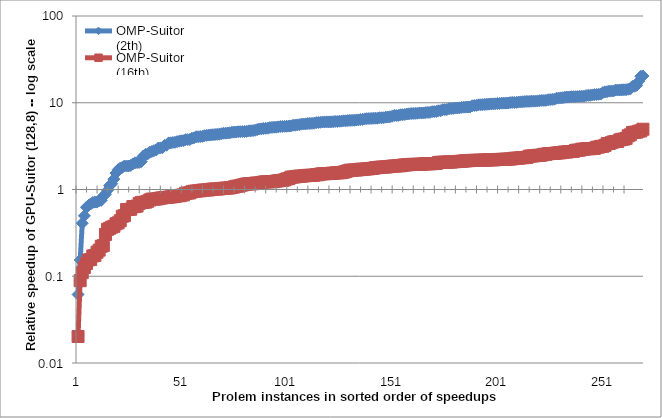
| Category | OMP-Suitor(2th) | OMP-Suitor(16th) |
|---|---|---|
| 0 | 0.062 | 0.02 |
| 1 | 0.154 | 0.089 |
| 2 | 0.409 | 0.11 |
| 3 | 0.497 | 0.126 |
| 4 | 0.624 | 0.14 |
| 5 | 0.655 | 0.154 |
| 6 | 0.682 | 0.156 |
| 7 | 0.709 | 0.171 |
| 8 | 0.716 | 0.174 |
| 9 | 0.716 | 0.189 |
| 10 | 0.741 | 0.2 |
| 11 | 0.749 | 0.221 |
| 12 | 0.843 | 0.226 |
| 13 | 0.881 | 0.303 |
| 14 | 0.981 | 0.347 |
| 15 | 1.11 | 0.357 |
| 16 | 1.167 | 0.368 |
| 17 | 1.315 | 0.376 |
| 18 | 1.548 | 0.402 |
| 19 | 1.692 | 0.413 |
| 20 | 1.763 | 0.436 |
| 21 | 1.798 | 0.492 |
| 22 | 1.865 | 0.5 |
| 23 | 1.865 | 0.587 |
| 24 | 1.867 | 0.588 |
| 25 | 1.894 | 0.592 |
| 26 | 1.972 | 0.635 |
| 27 | 2.029 | 0.636 |
| 28 | 2.044 | 0.644 |
| 29 | 2.047 | 0.691 |
| 30 | 2.094 | 0.71 |
| 31 | 2.434 | 0.71 |
| 32 | 2.539 | 0.715 |
| 33 | 2.571 | 0.731 |
| 34 | 2.694 | 0.756 |
| 35 | 2.739 | 0.774 |
| 36 | 2.805 | 0.775 |
| 37 | 2.847 | 0.776 |
| 38 | 3 | 0.783 |
| 39 | 3.012 | 0.796 |
| 40 | 3.028 | 0.8 |
| 41 | 3.218 | 0.809 |
| 42 | 3.235 | 0.81 |
| 43 | 3.449 | 0.816 |
| 44 | 3.45 | 0.822 |
| 45 | 3.485 | 0.827 |
| 46 | 3.499 | 0.831 |
| 47 | 3.563 | 0.846 |
| 48 | 3.602 | 0.847 |
| 49 | 3.643 | 0.861 |
| 50 | 3.653 | 0.868 |
| 51 | 3.752 | 0.904 |
| 52 | 3.76 | 0.91 |
| 53 | 3.77 | 0.914 |
| 54 | 3.9 | 0.942 |
| 55 | 3.938 | 0.955 |
| 56 | 4.054 | 0.959 |
| 57 | 4.06 | 0.964 |
| 58 | 4.077 | 0.968 |
| 59 | 4.097 | 0.983 |
| 60 | 4.17 | 0.985 |
| 61 | 4.213 | 0.988 |
| 62 | 4.237 | 0.989 |
| 63 | 4.263 | 1.002 |
| 64 | 4.281 | 1.011 |
| 65 | 4.307 | 1.013 |
| 66 | 4.325 | 1.013 |
| 67 | 4.337 | 1.016 |
| 68 | 4.392 | 1.026 |
| 69 | 4.451 | 1.031 |
| 70 | 4.462 | 1.039 |
| 71 | 4.48 | 1.039 |
| 72 | 4.501 | 1.044 |
| 73 | 4.57 | 1.055 |
| 74 | 4.587 | 1.07 |
| 75 | 4.598 | 1.089 |
| 76 | 4.637 | 1.092 |
| 77 | 4.64 | 1.111 |
| 78 | 4.653 | 1.127 |
| 79 | 4.666 | 1.141 |
| 80 | 4.679 | 1.16 |
| 81 | 4.741 | 1.161 |
| 82 | 4.753 | 1.162 |
| 83 | 4.782 | 1.166 |
| 84 | 4.819 | 1.183 |
| 85 | 4.91 | 1.185 |
| 86 | 4.984 | 1.189 |
| 87 | 5.007 | 1.195 |
| 88 | 5.045 | 1.219 |
| 89 | 5.07 | 1.224 |
| 90 | 5.089 | 1.226 |
| 91 | 5.17 | 1.23 |
| 92 | 5.193 | 1.231 |
| 93 | 5.226 | 1.234 |
| 94 | 5.229 | 1.252 |
| 95 | 5.274 | 1.258 |
| 96 | 5.321 | 1.271 |
| 97 | 5.327 | 1.272 |
| 98 | 5.347 | 1.291 |
| 99 | 5.36 | 1.324 |
| 100 | 5.386 | 1.335 |
| 101 | 5.406 | 1.388 |
| 102 | 5.505 | 1.392 |
| 103 | 5.511 | 1.399 |
| 104 | 5.557 | 1.416 |
| 105 | 5.581 | 1.425 |
| 106 | 5.681 | 1.426 |
| 107 | 5.686 | 1.434 |
| 108 | 5.705 | 1.444 |
| 109 | 5.764 | 1.454 |
| 110 | 5.765 | 1.457 |
| 111 | 5.786 | 1.459 |
| 112 | 5.814 | 1.462 |
| 113 | 5.897 | 1.481 |
| 114 | 5.918 | 1.482 |
| 115 | 5.952 | 1.508 |
| 116 | 5.992 | 1.518 |
| 117 | 6.005 | 1.521 |
| 118 | 6.012 | 1.523 |
| 119 | 6.019 | 1.529 |
| 120 | 6.025 | 1.536 |
| 121 | 6.046 | 1.54 |
| 122 | 6.082 | 1.551 |
| 123 | 6.085 | 1.554 |
| 124 | 6.121 | 1.56 |
| 125 | 6.135 | 1.566 |
| 126 | 6.19 | 1.586 |
| 127 | 6.191 | 1.61 |
| 128 | 6.238 | 1.64 |
| 129 | 6.255 | 1.669 |
| 130 | 6.27 | 1.67 |
| 131 | 6.29 | 1.678 |
| 132 | 6.319 | 1.679 |
| 133 | 6.347 | 1.685 |
| 134 | 6.41 | 1.712 |
| 135 | 6.432 | 1.712 |
| 136 | 6.519 | 1.716 |
| 137 | 6.556 | 1.729 |
| 138 | 6.577 | 1.733 |
| 139 | 6.584 | 1.748 |
| 140 | 6.609 | 1.753 |
| 141 | 6.628 | 1.781 |
| 142 | 6.638 | 1.787 |
| 143 | 6.712 | 1.802 |
| 144 | 6.715 | 1.813 |
| 145 | 6.716 | 1.813 |
| 146 | 6.826 | 1.818 |
| 147 | 6.848 | 1.83 |
| 148 | 6.893 | 1.842 |
| 149 | 6.996 | 1.859 |
| 150 | 7.137 | 1.863 |
| 151 | 7.138 | 1.867 |
| 152 | 7.145 | 1.876 |
| 153 | 7.264 | 1.881 |
| 154 | 7.283 | 1.903 |
| 155 | 7.322 | 1.92 |
| 156 | 7.407 | 1.922 |
| 157 | 7.456 | 1.936 |
| 158 | 7.508 | 1.946 |
| 159 | 7.515 | 1.947 |
| 160 | 7.542 | 1.949 |
| 161 | 7.571 | 1.949 |
| 162 | 7.627 | 1.953 |
| 163 | 7.628 | 1.957 |
| 164 | 7.629 | 1.971 |
| 165 | 7.709 | 1.977 |
| 166 | 7.737 | 1.979 |
| 167 | 7.752 | 1.982 |
| 168 | 7.898 | 1.983 |
| 169 | 7.904 | 1.993 |
| 170 | 7.944 | 1.997 |
| 171 | 8.086 | 2.045 |
| 172 | 8.096 | 2.061 |
| 173 | 8.32 | 2.061 |
| 174 | 8.332 | 2.063 |
| 175 | 8.355 | 2.068 |
| 176 | 8.536 | 2.069 |
| 177 | 8.581 | 2.073 |
| 178 | 8.6 | 2.089 |
| 179 | 8.685 | 2.092 |
| 180 | 8.696 | 2.104 |
| 181 | 8.729 | 2.109 |
| 182 | 8.834 | 2.117 |
| 183 | 8.884 | 2.13 |
| 184 | 8.911 | 2.141 |
| 185 | 8.936 | 2.152 |
| 186 | 8.959 | 2.154 |
| 187 | 9.229 | 2.164 |
| 188 | 9.294 | 2.168 |
| 189 | 9.325 | 2.17 |
| 190 | 9.47 | 2.171 |
| 191 | 9.478 | 2.173 |
| 192 | 9.542 | 2.175 |
| 193 | 9.559 | 2.191 |
| 194 | 9.608 | 2.191 |
| 195 | 9.644 | 2.197 |
| 196 | 9.692 | 2.197 |
| 197 | 9.709 | 2.201 |
| 198 | 9.715 | 2.205 |
| 199 | 9.806 | 2.219 |
| 200 | 9.819 | 2.22 |
| 201 | 9.89 | 2.226 |
| 202 | 9.893 | 2.229 |
| 203 | 9.893 | 2.231 |
| 204 | 9.93 | 2.242 |
| 205 | 10.04 | 2.247 |
| 206 | 10.086 | 2.258 |
| 207 | 10.092 | 2.289 |
| 208 | 10.104 | 2.295 |
| 209 | 10.185 | 2.297 |
| 210 | 10.235 | 2.322 |
| 211 | 10.258 | 2.329 |
| 212 | 10.334 | 2.331 |
| 213 | 10.351 | 2.346 |
| 214 | 10.366 | 2.422 |
| 215 | 10.422 | 2.43 |
| 216 | 10.433 | 2.444 |
| 217 | 10.44 | 2.457 |
| 218 | 10.49 | 2.474 |
| 219 | 10.552 | 2.479 |
| 220 | 10.643 | 2.494 |
| 221 | 10.645 | 2.544 |
| 222 | 10.648 | 2.548 |
| 223 | 10.833 | 2.585 |
| 224 | 10.875 | 2.597 |
| 225 | 10.92 | 2.602 |
| 226 | 10.983 | 2.609 |
| 227 | 11.273 | 2.628 |
| 228 | 11.313 | 2.645 |
| 229 | 11.395 | 2.653 |
| 230 | 11.431 | 2.683 |
| 231 | 11.579 | 2.706 |
| 232 | 11.626 | 2.707 |
| 233 | 11.647 | 2.734 |
| 234 | 11.727 | 2.74 |
| 235 | 11.739 | 2.747 |
| 236 | 11.742 | 2.827 |
| 237 | 11.785 | 2.843 |
| 238 | 11.861 | 2.843 |
| 239 | 11.876 | 2.915 |
| 240 | 11.884 | 2.915 |
| 241 | 12.103 | 2.946 |
| 242 | 12.167 | 2.953 |
| 243 | 12.177 | 2.958 |
| 244 | 12.305 | 2.965 |
| 245 | 12.404 | 2.982 |
| 246 | 12.441 | 3.068 |
| 247 | 12.538 | 3.084 |
| 248 | 12.608 | 3.143 |
| 249 | 13.116 | 3.148 |
| 250 | 13.33 | 3.221 |
| 251 | 13.421 | 3.38 |
| 252 | 13.629 | 3.389 |
| 253 | 13.631 | 3.468 |
| 254 | 13.658 | 3.542 |
| 255 | 14.011 | 3.571 |
| 256 | 14.015 | 3.578 |
| 257 | 14.028 | 3.733 |
| 258 | 14.082 | 3.787 |
| 259 | 14.115 | 3.813 |
| 260 | 14.131 | 3.881 |
| 261 | 14.299 | 4.16 |
| 262 | 14.446 | 4.27 |
| 263 | 15.42 | 4.544 |
| 264 | 15.489 | 4.571 |
| 265 | 15.862 | 4.58 |
| 266 | 17.633 | 4.702 |
| 267 | 20.2 | 4.743 |
| 268 | 20.363 | 4.954 |